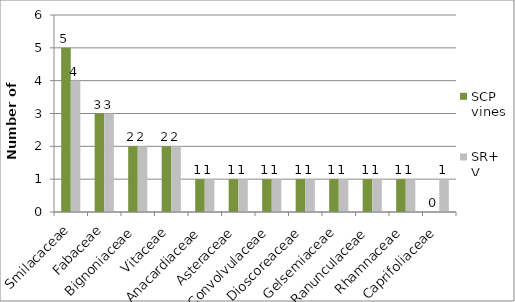
| Category | SCP vines | SR+V vines |
|---|---|---|
| Smilacaceae | 5 | 4 |
| Fabaceae | 3 | 3 |
| Bignoniaceae | 2 | 2 |
| Vitaceae | 2 | 2 |
| Anacardiaceae | 1 | 1 |
| Asteraceae | 1 | 1 |
| Convolvulaceae | 1 | 1 |
| Dioscoreaceae | 1 | 1 |
| Gelsemiaceae | 1 | 1 |
| Ranunculaceae | 1 | 1 |
| Rhamnaceae | 1 | 1 |
| Caprifoliaceae | 0 | 1 |